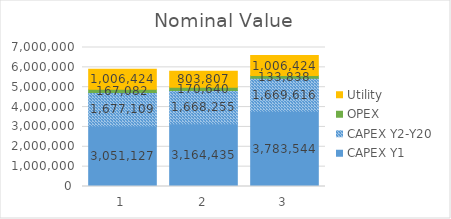
| Category | CAPEX Y1 | CAPEX Y2-Y20 | OPEX | Utility |
|---|---|---|---|---|
| 1.0 | 3051126.98 | 1677109.237 | 167082.131 | 1006424.285 |
| 2.0 | 3164434.98 | 1668255.221 | 170640.163 | 803807.089 |
| 3.0 | 3783544.18 | 1669615.54 | 133838.388 | 1006424.285 |